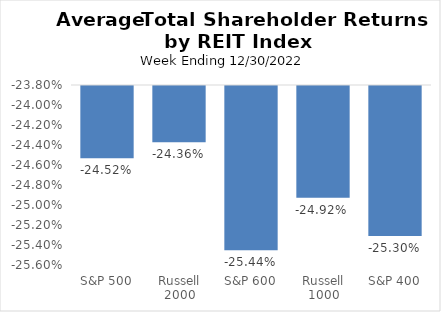
| Category | Average
TSR |
|---|---|
| S&P 500 | -0.245 |
| Russell 2000 | -0.244 |
| S&P 600 | -0.254 |
| Russell 1000 | -0.249 |
| S&P 400 | -0.253 |